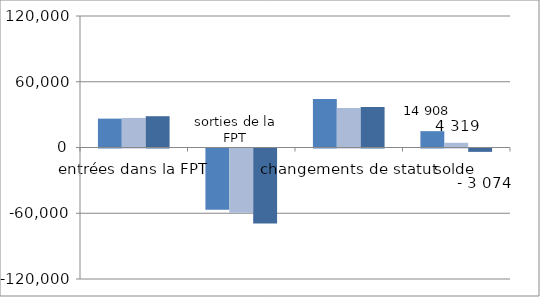
| Category | 2013-2014 | 2014-2015 | 2015-2016 |
|---|---|---|---|
| entrées dans la FPT | 26344 | 26983 | 28555 |
|  | -55790 | -58636 | -68555 |
| changements de statut | 44354 | 35972 | 36926 |
| solde | 14908 | 4319 | -3074 |